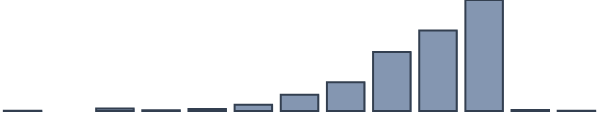
| Category | Series 0 |
|---|---|
| 0 | 0.1 |
| 1 | 0 |
| 2 | 0.8 |
| 3 | 0.2 |
| 4 | 0.6 |
| 5 | 2 |
| 6 | 5.1 |
| 7 | 9.1 |
| 8 | 18.6 |
| 9 | 25.4 |
| 10 | 37.7 |
| 11 | 0.3 |
| 12 | 0.1 |